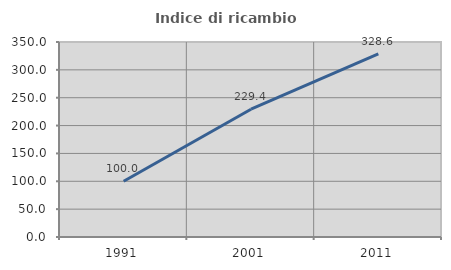
| Category | Indice di ricambio occupazionale  |
|---|---|
| 1991.0 | 100 |
| 2001.0 | 229.412 |
| 2011.0 | 328.571 |